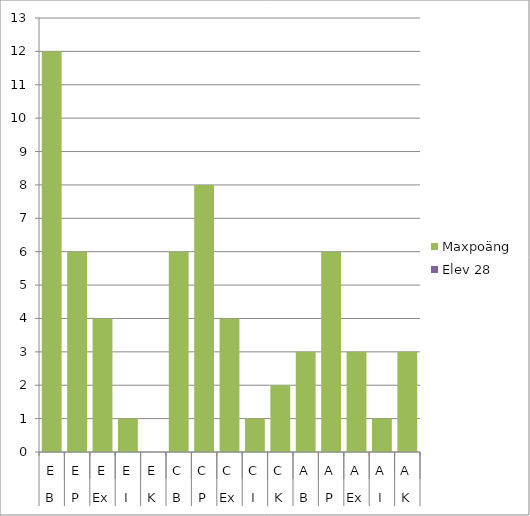
| Category | Maxpoäng | Elev 28 |
|---|---|---|
| 0 | 12 | 0 |
| 1 | 6 | 0 |
| 2 | 4 | 0 |
| 3 | 1 | 0 |
| 4 | 0 | 0 |
| 5 | 6 | 0 |
| 6 | 8 | 0 |
| 7 | 4 | 0 |
| 8 | 1 | 0 |
| 9 | 2 | 0 |
| 10 | 3 | 0 |
| 11 | 6 | 0 |
| 12 | 3 | 0 |
| 13 | 1 | 0 |
| 14 | 3 | 0 |